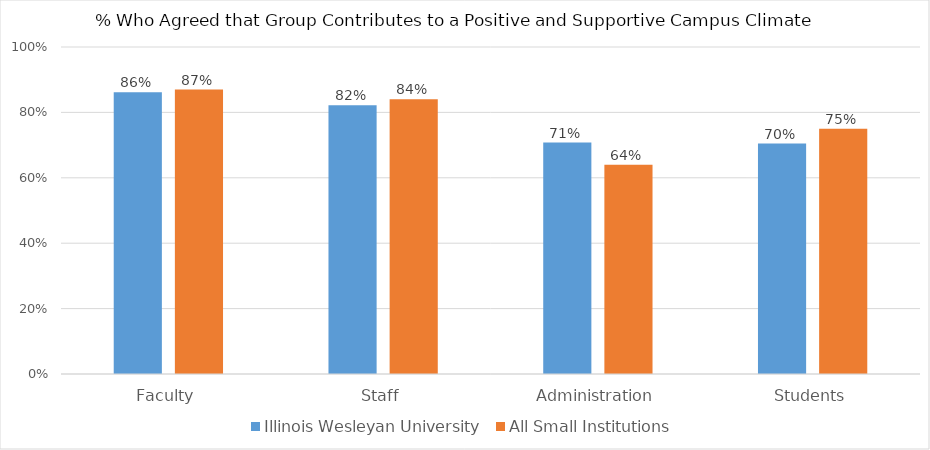
| Category | Illinois Wesleyan University | All Small Institutions |
|---|---|---|
| Faculty | 0.861 | 0.87 |
| Staff | 0.822 | 0.84 |
| Administration | 0.708 | 0.64 |
| Students | 0.705 | 0.75 |